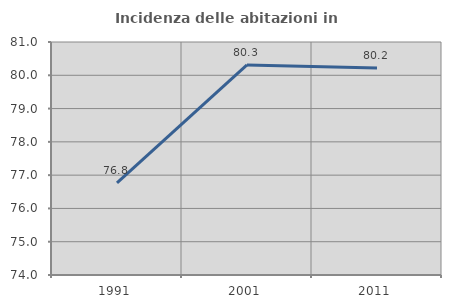
| Category | Incidenza delle abitazioni in proprietà  |
|---|---|
| 1991.0 | 76.766 |
| 2001.0 | 80.311 |
| 2011.0 | 80.218 |